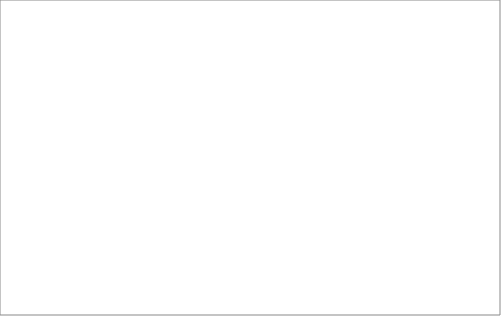
| Category | 2008 | 2009 | 2010 | 2011 | 2012 | 2013 |
|---|---|---|---|---|---|---|
| mazowieckie | 45316.02 | 225191.9 | 181869 | 143178.55 | 137286 | 107135.69 |